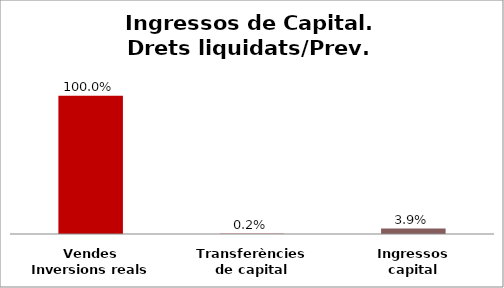
| Category | Series 0 |
|---|---|
| Vendes Inversions reals | 1 |
| Transferències de capital | 0.002 |
| Ingressos capital | 0.039 |